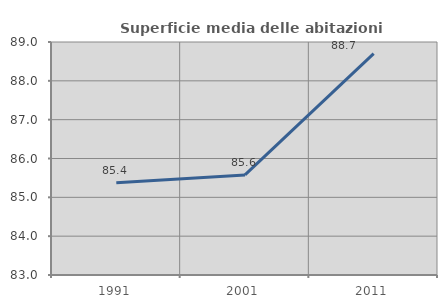
| Category | Superficie media delle abitazioni occupate |
|---|---|
| 1991.0 | 85.374 |
| 2001.0 | 85.577 |
| 2011.0 | 88.7 |